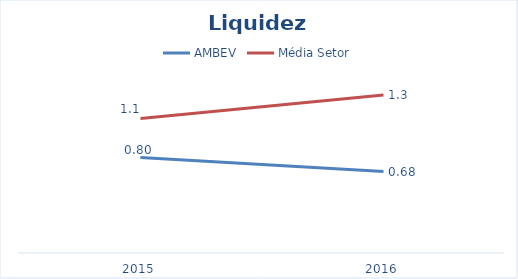
| Category | AMBEV | Média Setor |
|---|---|---|
| 2015.0 | 0.795 | 1.12 |
| 2016.0 | 0.679 | 1.316 |